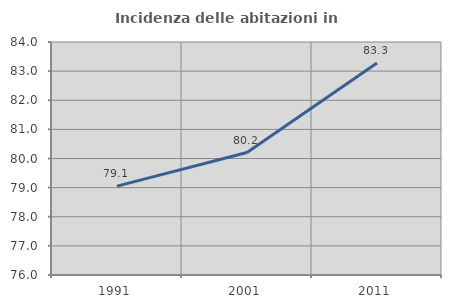
| Category | Incidenza delle abitazioni in proprietà  |
|---|---|
| 1991.0 | 79.05 |
| 2001.0 | 80.204 |
| 2011.0 | 83.279 |